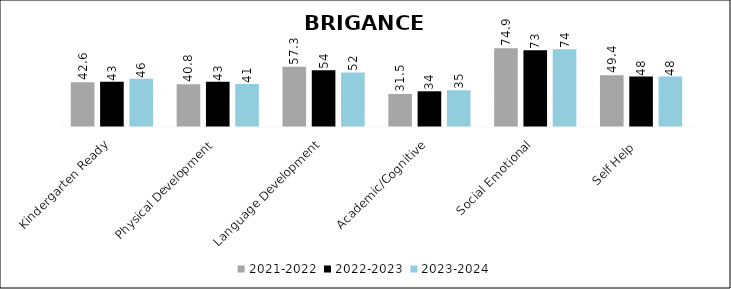
| Category | 2021-2022 | 2022-2023 | 2023-2024 |
|---|---|---|---|
| Kindergarten Ready | 42.6 | 43 | 46 |
| Physical Development | 40.8 | 43 | 41 |
| Language Development | 57.3 | 54 | 52 |
| Academic/Cognitive | 31.5 | 34 | 35 |
| Social Emotional | 74.9 | 73 | 74 |
| Self Help  | 49.4 | 48 | 48 |